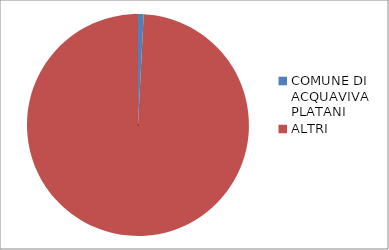
| Category | Series 0 |
|---|---|
| COMUNE DI ACQUAVIVA PLATANI | 0.008 |
| ALTRI | 0.917 |